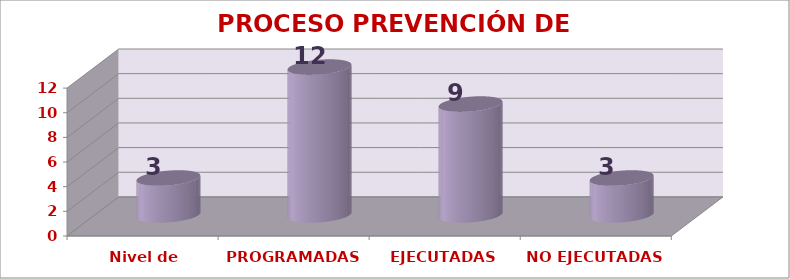
| Category | PROCESO PREVENCIÓN DE RIESGOS |
|---|---|
| Nivel de satisfacción | 3 |
| PROGRAMADAS | 12 |
| EJECUTADAS | 9 |
| NO EJECUTADAS | 3 |